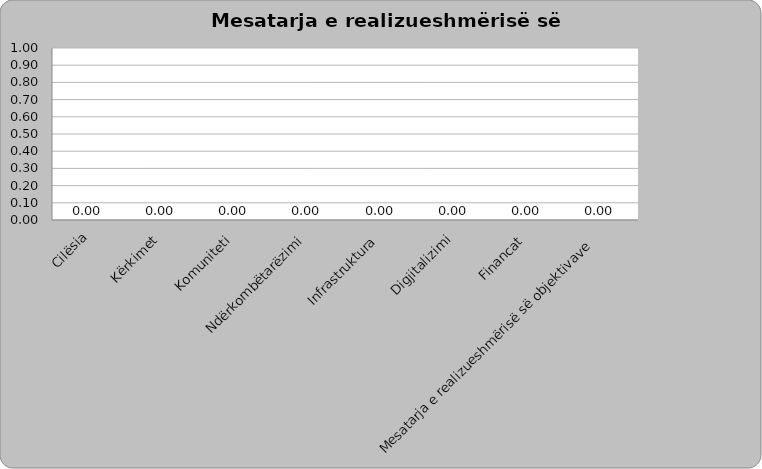
| Category | Series 0 |
|---|---|
| Cilësia | 0 |
| Kërkimet | 0 |
| Komuniteti | 0 |
| Ndërkombëtarëzimi | 0 |
| Infrastruktura | 0 |
| Digjitalizimi | 0 |
| Financat | 0 |
| Mesatarja e realizueshmërisë së objektivave  | 0 |